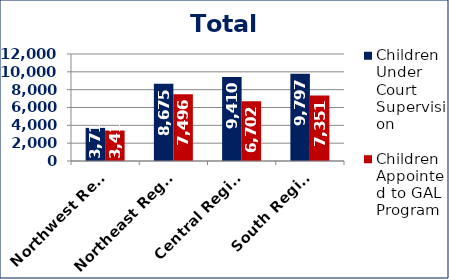
| Category | Children Under Court Supervision  | Children Appointed to GAL Program  |
|---|---|---|
| Northwest Region | 3714 | 3418 |
| Northeast Region | 8675 | 7496 |
| Central Region | 9410 | 6702 |
| South Region | 9797 | 7351 |